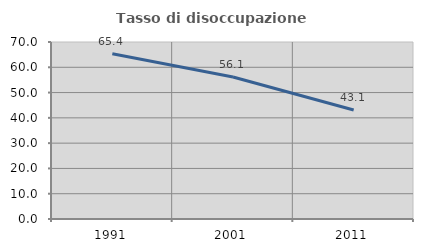
| Category | Tasso di disoccupazione giovanile  |
|---|---|
| 1991.0 | 65.385 |
| 2001.0 | 56.14 |
| 2011.0 | 43.103 |